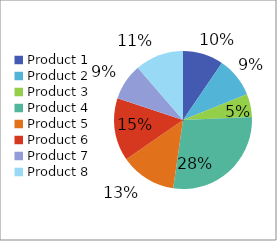
| Category | Series 0 | Series 1 |
|---|---|---|
| Product 1 | 0.095 | 0.095 |
| Product 2 | 0.094 | 0.094 |
| Product 3 | 0.054 | 0.054 |
| Product 4 | 0.28 | 0.28 |
| Product 5 | 0.131 | 0.131 |
| Product 6 | 0.147 | 0.147 |
| Product 7 | 0.085 | 0.085 |
| Product 8 | 0.114 | 0.114 |